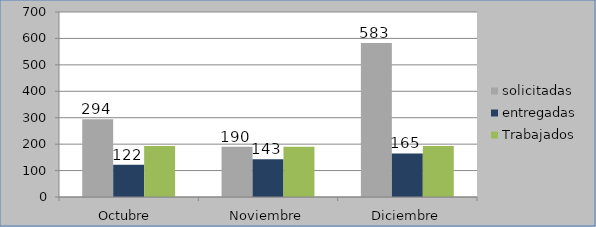
| Category | solicitadas | entregadas | Trabajados |
|---|---|---|---|
| Octubre  | 294 | 122 | 193 |
| Noviembre | 190 | 143 | 190 |
| Diciembre | 583 | 165 | 193 |